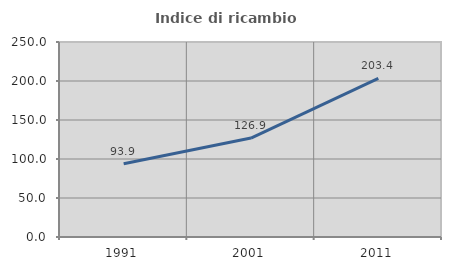
| Category | Indice di ricambio occupazionale  |
|---|---|
| 1991.0 | 93.886 |
| 2001.0 | 126.853 |
| 2011.0 | 203.414 |